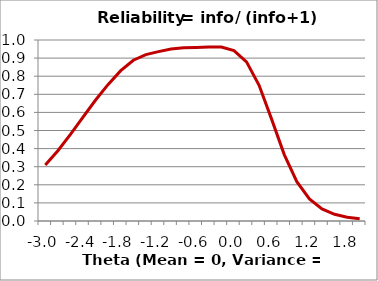
| Category | Reliability |
|---|---|
| -3.0 | 0.31 |
| -2.8 | 0.389 |
| -2.6 | 0.478 |
| -2.4 | 0.574 |
| -2.2 | 0.668 |
| -2.0 | 0.755 |
| -1.8 | 0.831 |
| -1.6 | 0.888 |
| -1.4 | 0.919 |
| -1.2 | 0.936 |
| -1.0 | 0.95 |
| -0.8 | 0.957 |
| -0.6 | 0.959 |
| -0.4 | 0.961 |
| -0.2 | 0.961 |
| 0.0 | 0.942 |
| 0.2 | 0.879 |
| 0.4 | 0.75 |
| 0.6 | 0.561 |
| 0.8 | 0.367 |
| 1.0 | 0.217 |
| 1.2 | 0.122 |
| 1.4 | 0.067 |
| 1.6 | 0.037 |
| 1.8 | 0.021 |
| 2.0 | 0.012 |